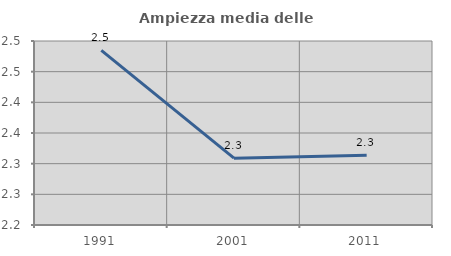
| Category | Ampiezza media delle famiglie |
|---|---|
| 1991.0 | 2.485 |
| 2001.0 | 2.309 |
| 2011.0 | 2.314 |